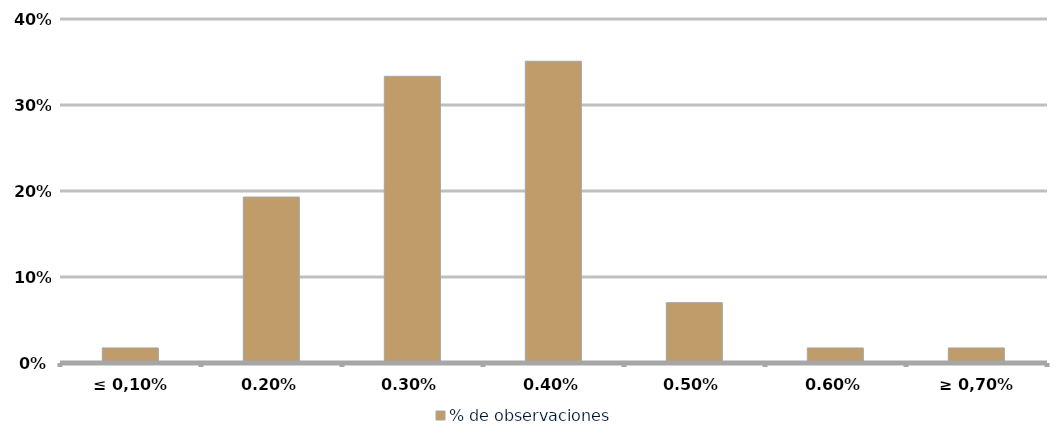
| Category | % de observaciones  |
|---|---|
| ≤ 0,10% | 0.018 |
| 0,20% | 0.193 |
| 0,30% | 0.333 |
| 0,40% | 0.351 |
| 0,50% | 0.07 |
| 0,60% | 0.018 |
| ≥ 0,70% | 0.018 |